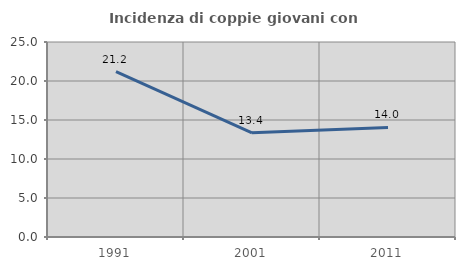
| Category | Incidenza di coppie giovani con figli |
|---|---|
| 1991.0 | 21.206 |
| 2001.0 | 13.36 |
| 2011.0 | 14.045 |